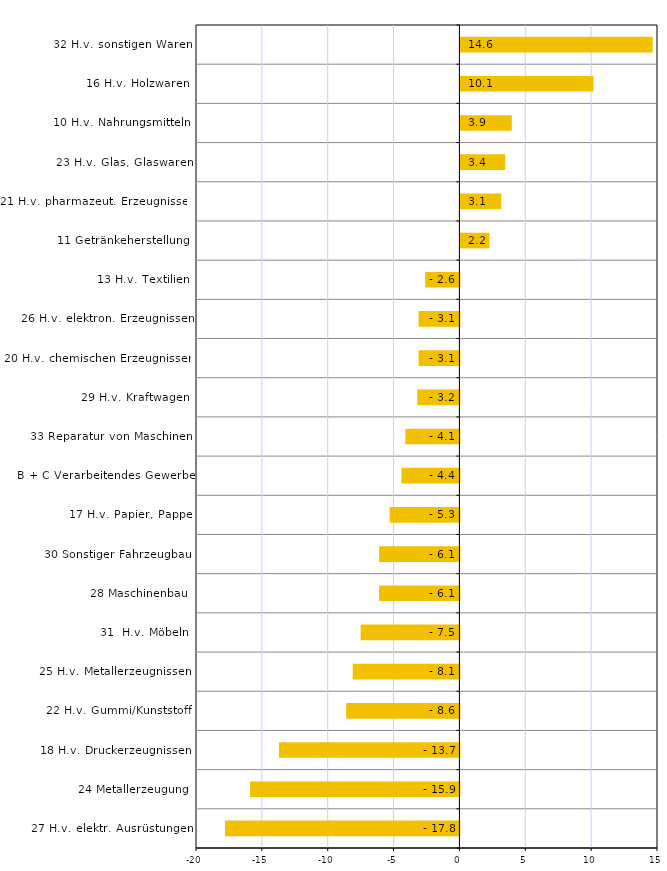
| Category | Series 0 |
|---|---|
| 27 H.v. elektr. Ausrüstungen | -17.8 |
| 24 Metallerzeugung | -15.9 |
| 18 H.v. Druckerzeugnissen | -13.7 |
| 22 H.v. Gummi/Kunststoff | -8.6 |
| 25 H.v. Metallerzeugnissen | -8.1 |
| 31  H.v. Möbeln | -7.5 |
| 28 Maschinenbau | -6.1 |
| 30 Sonstiger Fahrzeugbau | -6.1 |
| 17 H.v. Papier, Pappe | -5.3 |
| B + C Verarbeitendes Gewerbe | -4.4 |
| 33 Reparatur von Maschinen | -4.1 |
| 29 H.v. Kraftwagen | -3.2 |
| 20 H.v. chemischen Erzeugnissen | -3.1 |
| 26 H.v. elektron. Erzeugnissen | -3.1 |
| 13 H.v. Textilien | -2.6 |
| 11 Getränkeherstellung | 2.2 |
| 21 H.v. pharmazeut. Erzeugnissen | 3.1 |
| 23 H.v. Glas, Glaswaren | 3.4 |
| 10 H.v. Nahrungsmitteln | 3.9 |
| 16 H.v. Holzwaren | 10.1 |
| 32 H.v. sonstigen Waren | 14.6 |